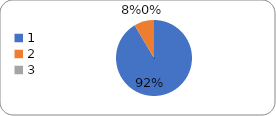
| Category | Series 0 |
|---|---|
| 0 | 97 |
| 1 | 9 |
| 2 | 0 |